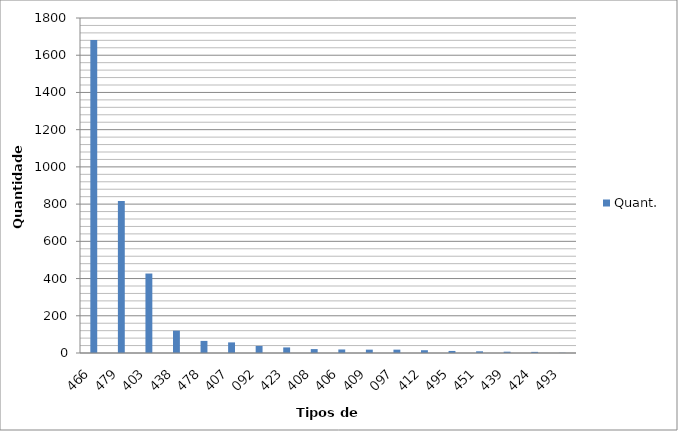
| Category | Quant. |
|---|---|
| 466 | 1682 |
| 479 | 817 |
| 403 | 427 |
| 438 | 120 |
| 478 | 65 |
| 407 | 57 |
| 092 | 38 |
| 423 | 30 |
| 408 | 21 |
| 406 | 19 |
| 409 | 18 |
| 097 | 18 |
| 412 | 15 |
| 495 | 11 |
| 451 | 9 |
| 439 | 7 |
| 424 | 6 |
| 493 | 1 |